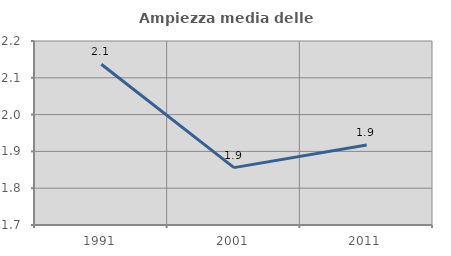
| Category | Ampiezza media delle famiglie |
|---|---|
| 1991.0 | 2.137 |
| 2001.0 | 1.856 |
| 2011.0 | 1.917 |